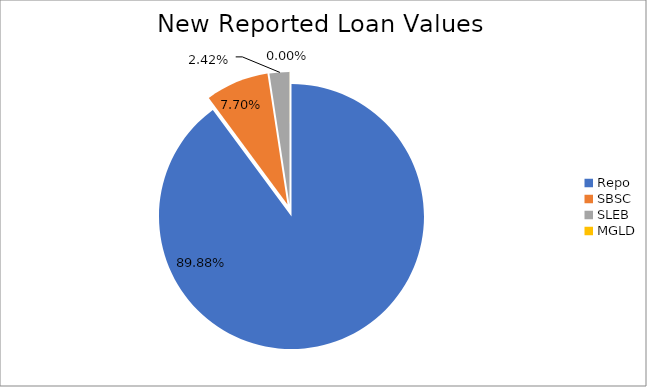
| Category | Series 0 |
|---|---|
| Repo | 13021972.045 |
| SBSC | 1115240.872 |
| SLEB | 350183.983 |
| MGLD | 687.587 |